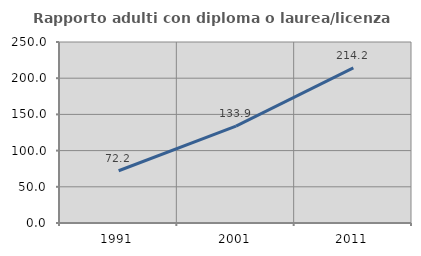
| Category | Rapporto adulti con diploma o laurea/licenza media  |
|---|---|
| 1991.0 | 72.204 |
| 2001.0 | 133.871 |
| 2011.0 | 214.245 |